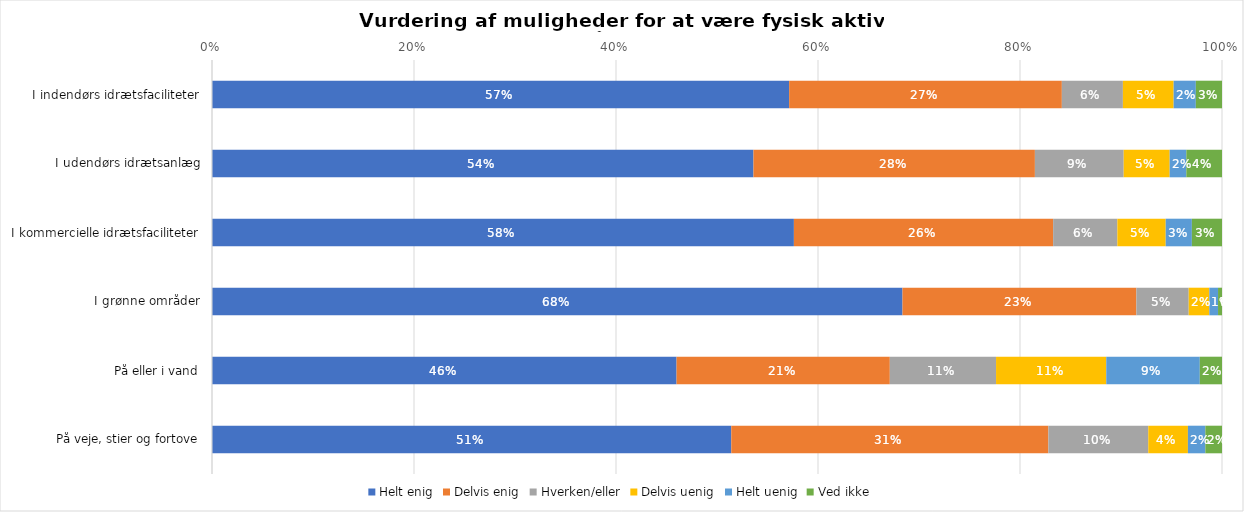
| Category | Helt enig | Delvis enig | Hverken/eller | Delvis uenig | Helt uenig | Ved ikke |
|---|---|---|---|---|---|---|
| I indendørs idrætsfaciliteter | 0.571 | 0.27 | 0.06 | 0.05 | 0.022 | 0.026 |
| I udendørs idrætsanlæg | 0.536 | 0.279 | 0.088 | 0.046 | 0.016 | 0.035 |
| I kommercielle idrætsfaciliteter | 0.576 | 0.257 | 0.064 | 0.048 | 0.026 | 0.03 |
| I grønne områder | 0.684 | 0.232 | 0.052 | 0.02 | 0.009 | 0.004 |
| På eller i vand | 0.46 | 0.211 | 0.105 | 0.109 | 0.093 | 0.022 |
| På veje, stier og fortove | 0.514 | 0.314 | 0.099 | 0.039 | 0.017 | 0.016 |